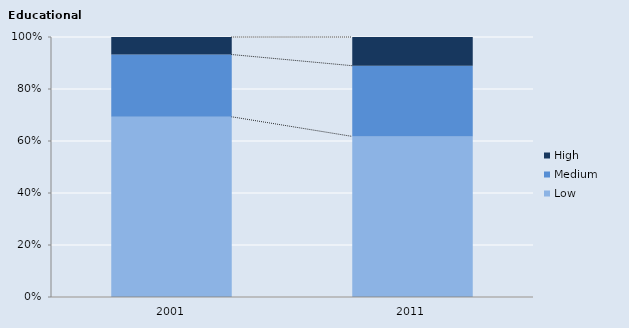
| Category | Low | Medium     | High |
|---|---|---|---|
| 2001.0 | 799 | 276 | 77.79 |
| 2011.0 | 895 | 394 | 160 |